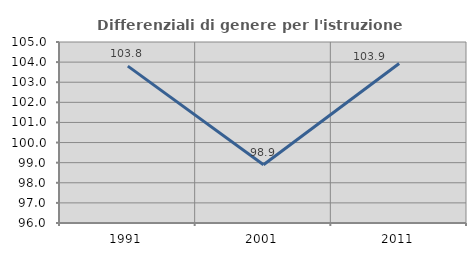
| Category | Differenziali di genere per l'istruzione superiore |
|---|---|
| 1991.0 | 103.799 |
| 2001.0 | 98.897 |
| 2011.0 | 103.931 |